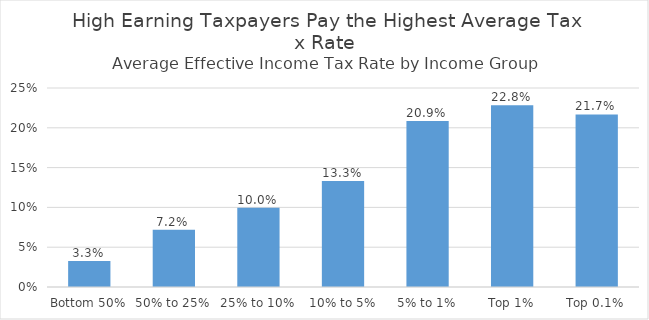
| Category | Average Tax Rate |
|---|---|
| Bottom 50% | 0.033 |
| 50% to 25% | 0.072 |
| 25% to 10% | 0.1 |
| 10% to 5% | 0.133 |
| 5% to 1% | 0.209 |
| Top 1% | 0.228 |
| Top 0.1% | 0.217 |